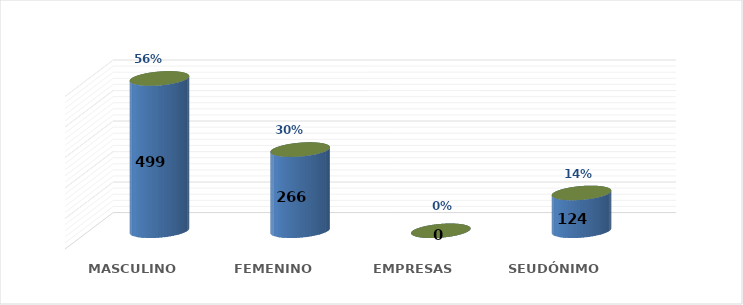
| Category | SOLICITUD POR GÉNERO | Series 1 |
|---|---|---|
| MASCULINO | 499 | 0.561 |
| FEMENINO | 266 | 0.299 |
| EMPRESAS | 0 | 0 |
| SEUDÓNIMO | 124 | 0.139 |